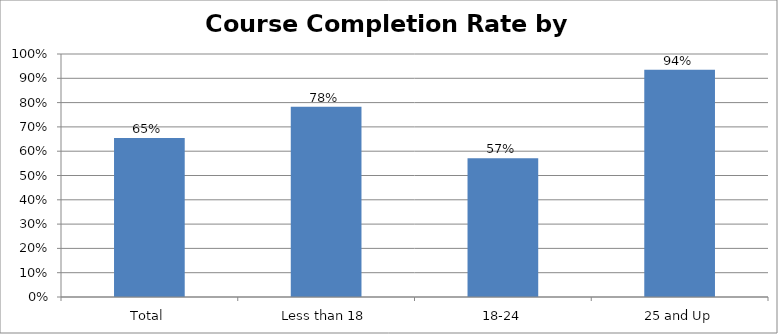
| Category | Course Completion by Age |
|---|---|
| Total | 0.655 |
| Less than 18 | 0.783 |
| 18-24 | 0.571 |
| 25 and Up | 0.935 |